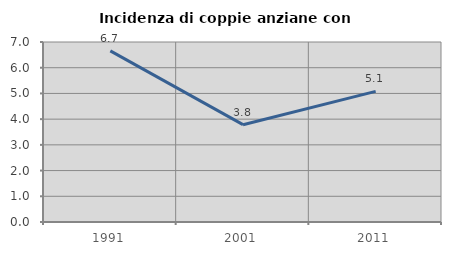
| Category | Incidenza di coppie anziane con figli |
|---|---|
| 1991.0 | 6.653 |
| 2001.0 | 3.785 |
| 2011.0 | 5.078 |